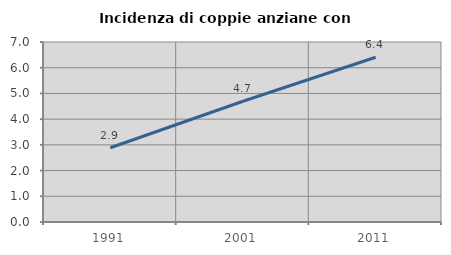
| Category | Incidenza di coppie anziane con figli |
|---|---|
| 1991.0 | 2.887 |
| 2001.0 | 4.696 |
| 2011.0 | 6.407 |